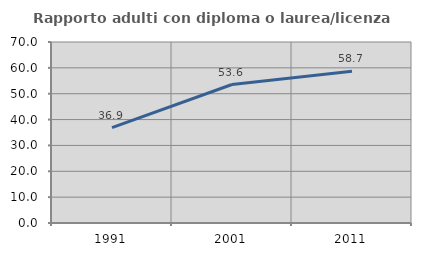
| Category | Rapporto adulti con diploma o laurea/licenza media  |
|---|---|
| 1991.0 | 36.9 |
| 2001.0 | 53.552 |
| 2011.0 | 58.658 |